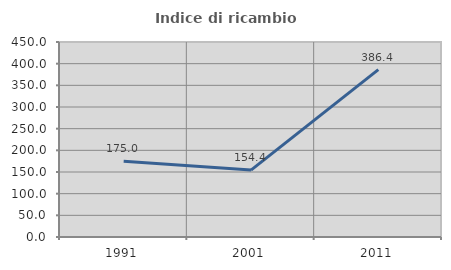
| Category | Indice di ricambio occupazionale  |
|---|---|
| 1991.0 | 175 |
| 2001.0 | 154.386 |
| 2011.0 | 386.364 |